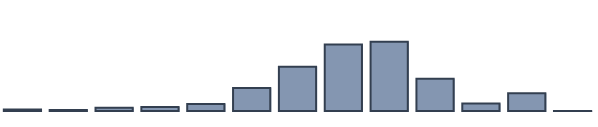
| Category | Series 0 |
|---|---|
| 0 | 0.522 |
| 1 | 0.348 |
| 2 | 1.13 |
| 3 | 1.478 |
| 4 | 2.565 |
| 5 | 8.304 |
| 6 | 15.957 |
| 7 | 23.957 |
| 8 | 24.913 |
| 9 | 11.609 |
| 10 | 2.739 |
| 11 | 6.435 |
| 12 | 0.043 |